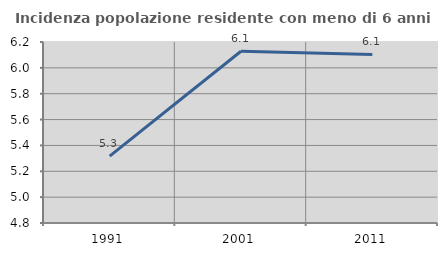
| Category | Incidenza popolazione residente con meno di 6 anni |
|---|---|
| 1991.0 | 5.317 |
| 2001.0 | 6.128 |
| 2011.0 | 6.104 |